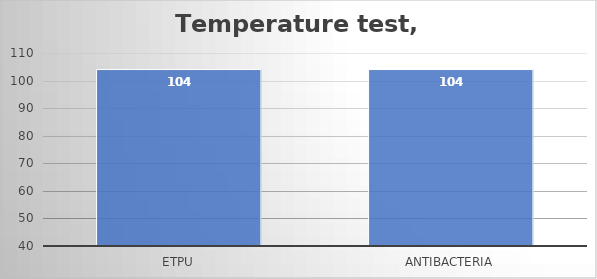
| Category | °C |
|---|---|
| eTPU | 104 |
| Antibacteria | 104 |